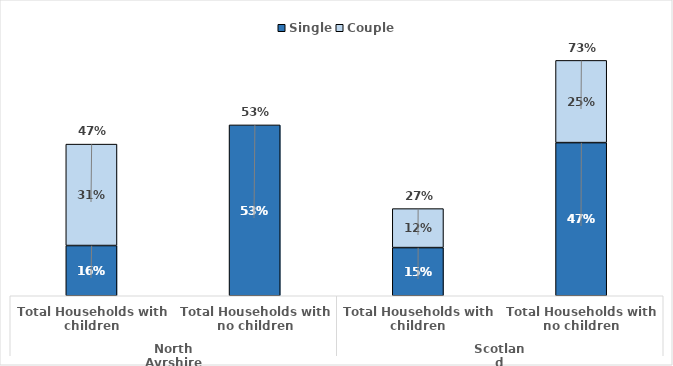
| Category | Single | Couple |
|---|---|---|
| 0 | 0.156 | 0.315 |
| 1 | 0.53 | 0 |
| 2 | 0.149 | 0.121 |
| 3 | 0.475 | 0.255 |